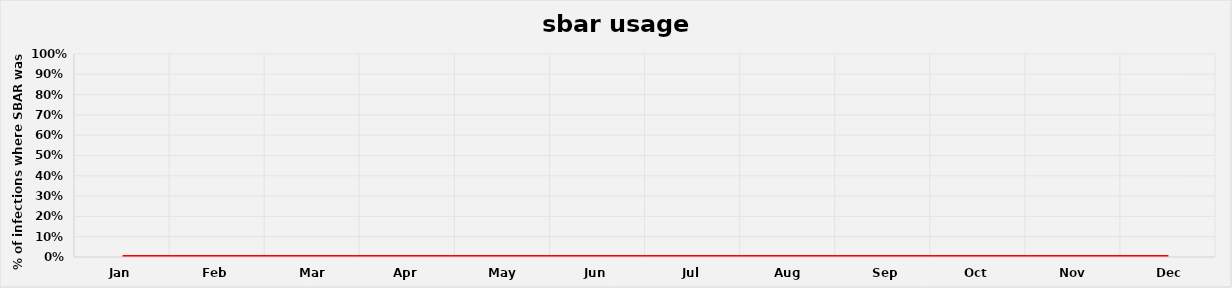
| Category | SBAR Used and Completed |
|---|---|
| Jan | 0 |
| Feb | 0 |
| Mar | 0 |
| Apr | 0 |
| May | 0 |
| Jun | 0 |
| Jul | 0 |
| Aug | 0 |
| Sep | 0 |
| Oct | 0 |
| Nov | 0 |
| Dec | 0 |